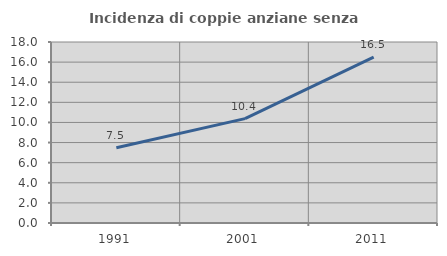
| Category | Incidenza di coppie anziane senza figli  |
|---|---|
| 1991.0 | 7.477 |
| 2001.0 | 10.377 |
| 2011.0 | 16.505 |